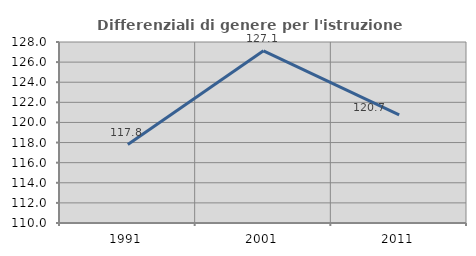
| Category | Differenziali di genere per l'istruzione superiore |
|---|---|
| 1991.0 | 117.802 |
| 2001.0 | 127.126 |
| 2011.0 | 120.747 |